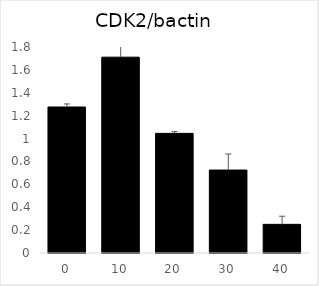
| Category | Series 0 |
|---|---|
| 0.0 | 1.276 |
| 10.0 | 1.711 |
| 20.0 | 1.045 |
| 30.0 | 0.725 |
| 40.0 | 0.25 |